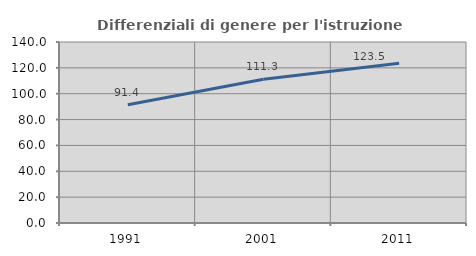
| Category | Differenziali di genere per l'istruzione superiore |
|---|---|
| 1991.0 | 91.406 |
| 2001.0 | 111.252 |
| 2011.0 | 123.539 |